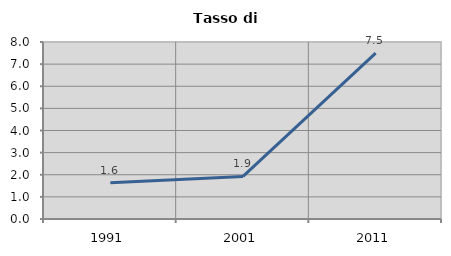
| Category | Tasso di disoccupazione   |
|---|---|
| 1991.0 | 1.639 |
| 2001.0 | 1.923 |
| 2011.0 | 7.5 |